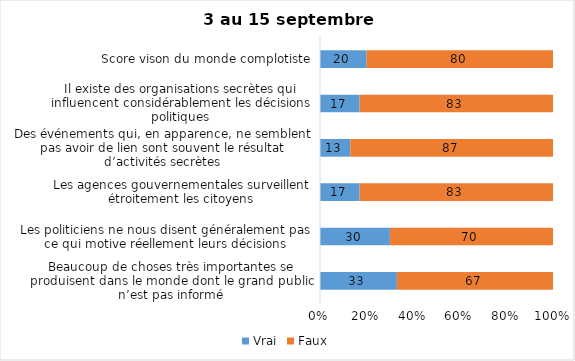
| Category | Vrai | Faux |
|---|---|---|
| Beaucoup de choses très importantes se produisent dans le monde dont le grand public n’est pas informé | 33 | 67 |
| Les politiciens ne nous disent généralement pas ce qui motive réellement leurs décisions | 30 | 70 |
| Les agences gouvernementales surveillent étroitement les citoyens | 17 | 83 |
| Des événements qui, en apparence, ne semblent pas avoir de lien sont souvent le résultat d’activités secrètes | 13 | 87 |
| Il existe des organisations secrètes qui influencent considérablement les décisions politiques | 17 | 83 |
| Score vison du monde complotiste | 20 | 80 |